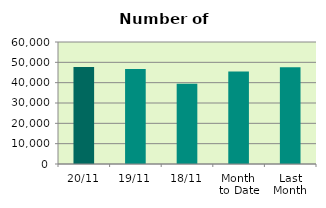
| Category | Series 0 |
|---|---|
| 20/11 | 47708 |
| 19/11 | 46688 |
| 18/11 | 39468 |
| Month 
to Date | 45435.143 |
| Last
Month | 47528 |